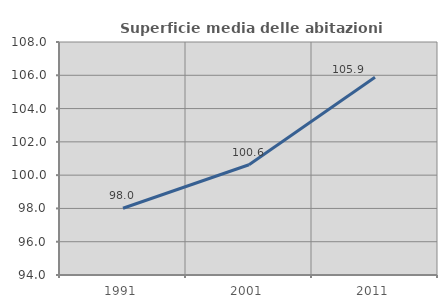
| Category | Superficie media delle abitazioni occupate |
|---|---|
| 1991.0 | 98.013 |
| 2001.0 | 100.622 |
| 2011.0 | 105.882 |